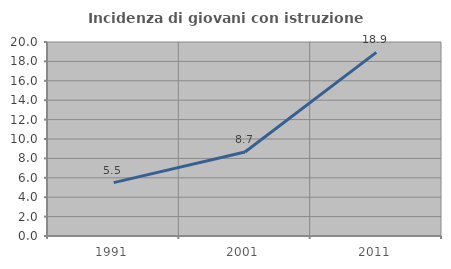
| Category | Incidenza di giovani con istruzione universitaria |
|---|---|
| 1991.0 | 5.505 |
| 2001.0 | 8.661 |
| 2011.0 | 18.935 |